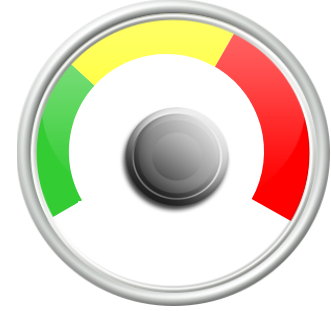
| Category | PIE |
|---|---|
| 0 | 46 |
| 1 | 3.18 |
| 2 | 189.32 |